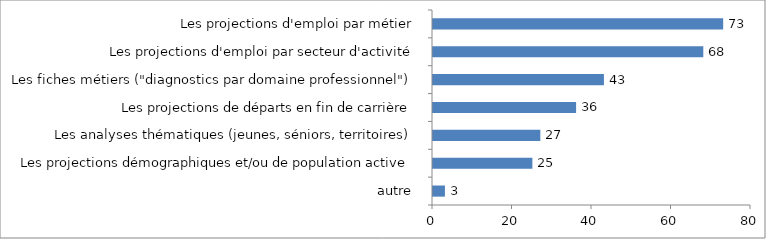
| Category | Series 0 |
|---|---|
| autre  | 3 |
| Les projections démographiques et/ou de population active | 25 |
| Les analyses thématiques (jeunes, séniors, territoires) | 27 |
| Les projections de départs en fin de carrière | 36 |
| Les fiches métiers ("diagnostics par domaine professionnel") | 43 |
| Les projections d'emploi par secteur d'activité | 68 |
| Les projections d'emploi par métier | 73 |